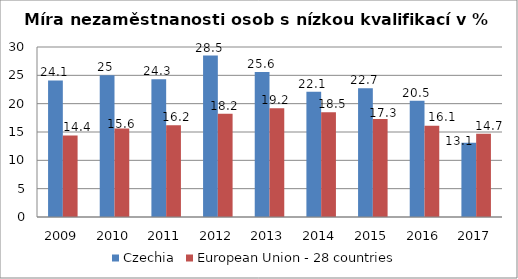
| Category | Czechia | European Union - 28 countries |
|---|---|---|
| 2009 | 24.1 | 14.4 |
| 2010 | 25 | 15.6 |
| 2011 | 24.3 | 16.2 |
| 2012 | 28.5 | 18.2 |
| 2013 | 25.6 | 19.2 |
| 2014 | 22.1 | 18.5 |
| 2015 | 22.7 | 17.3 |
| 2016 | 20.5 | 16.1 |
| 2017 | 13.1 | 14.7 |